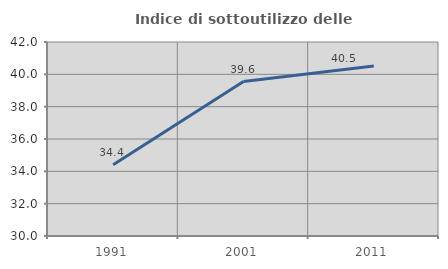
| Category | Indice di sottoutilizzo delle abitazioni  |
|---|---|
| 1991.0 | 34.403 |
| 2001.0 | 39.554 |
| 2011.0 | 40.516 |